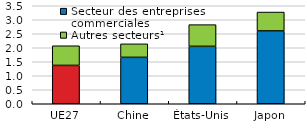
| Category | Secteur des entreprises commerciales | Autres secteurs¹ |
|---|---|---|
| UE27 | 1.37 | 0.702 |
| Chine | 1.657 | 0.483 |
| États-Unis | 2.051 | 0.775 |
| Japon | 2.601 | 0.674 |